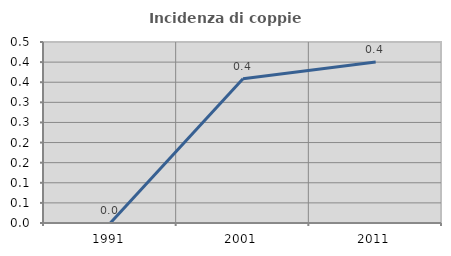
| Category | Incidenza di coppie miste |
|---|---|
| 1991.0 | 0 |
| 2001.0 | 0.359 |
| 2011.0 | 0.4 |